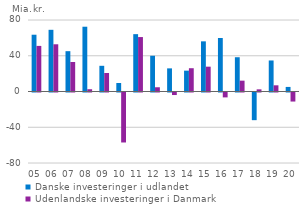
| Category | Danske investeringer i udlandet | Udenlandske investeringer i Danmark |
|---|---|---|
| 05 | 63.532 | 51.02 |
| 06 | 69.026 | 52.833 |
| 07 | 45.122 | 33.02 |
| 08 | 72.481 | 2.529 |
| 09 | 28.752 | 20.727 |
| 10 | 9.494 | -55.923 |
| 11 | 64.161 | 60.905 |
| 12 | 39.999 | 4.747 |
| 13 | 25.879 | -2.841 |
| 14 | 23.335 | 26.049 |
| 15 | 56.119 | 27.784 |
| 16 | 59.848 | -5.475 |
| 17 | 38.34 | 12.133 |
| 18 | -30.951 | 2.403 |
| 19 | 34.713 | 6.924 |
| 20 | 5.122 | -10.121 |